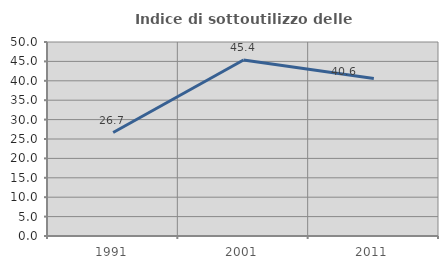
| Category | Indice di sottoutilizzo delle abitazioni  |
|---|---|
| 1991.0 | 26.667 |
| 2001.0 | 45.366 |
| 2011.0 | 40.58 |